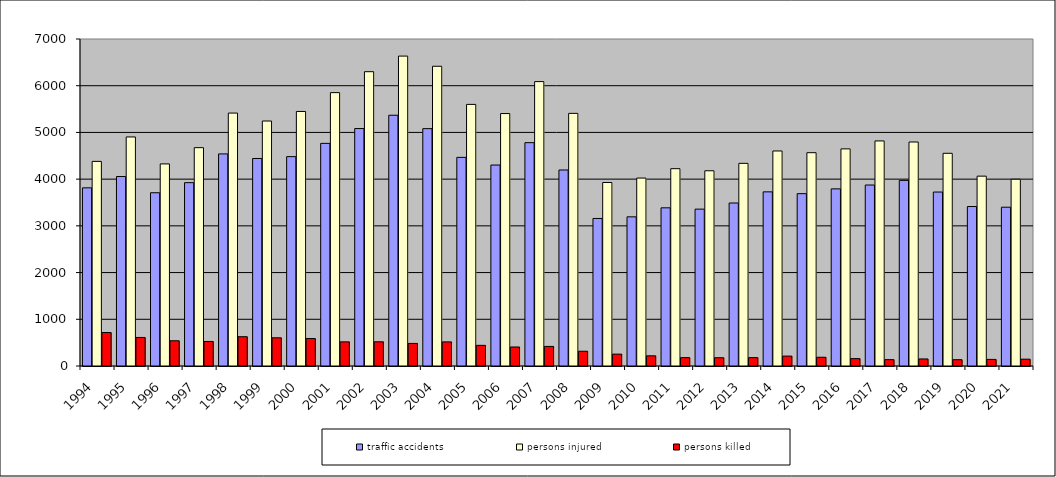
| Category | traffic accidents | persons injured | persons killed |
|---|---|---|---|
| 1994.0 | 3814 | 4380 | 717 |
| 1995.0 | 4056 | 4903 | 611 |
| 1996.0 | 3709 | 4326 | 540 |
| 1997.0 | 3925 | 4674 | 525 |
| 1998.0 | 4540 | 5414 | 627 |
| 1999.0 | 4442 | 5244 | 604 |
| 2000.0 | 4482 | 5449 | 588 |
| 2001.0 | 4766 | 5852 | 517 |
| 2002.0 | 5083 | 6300 | 518 |
| 2003.0 | 5368 | 6634 | 483 |
| 2004.0 | 5081 | 6416 | 516 |
| 2005.0 | 4466 | 5600 | 442 |
| 2006.0 | 4302 | 5404 | 407 |
| 2007.0 | 4781 | 6088 | 419 |
| 2008.0 | 4196 | 5408 | 316 |
| 2009.0 | 3158 | 3928 | 254 |
| 2010.0 | 3193 | 4023 | 218 |
| 2011.0 | 3386 | 4224 | 179 |
| 2012.0 | 3358 | 4179 | 177 |
| 2013.0 | 3489 | 4338 | 179 |
| 2014.0 | 3728 | 4603 | 212 |
| 2015.0 | 3689 | 4566 | 187 |
| 2016.0 | 3792 | 4648 | 158 |
| 2017.0 | 3874 | 4818 | 136 |
| 2018.0 | 3973 | 4795 | 151 |
| 2019.0 | 3724 | 4553 | 135 |
| 2020.0 | 3414 | 4064 | 141 |
| 2021.0 | 3399 | 3998 | 146 |